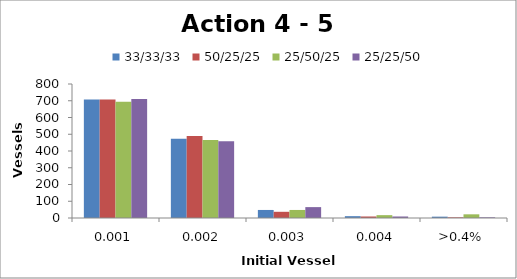
| Category | 33/33/33 | 50/25/25 | 25/50/25 | 25/25/50 |
|---|---|---|---|---|
| 0.100% | 707 | 708 | 694 | 711 |
| 0.200% | 473 | 489 | 466 | 458 |
| 0.300% | 48 | 37 | 48 | 65 |
| 0.400% | 11 | 9 | 17 | 9 |
| >0.4% | 8 | 4 | 22 | 4 |